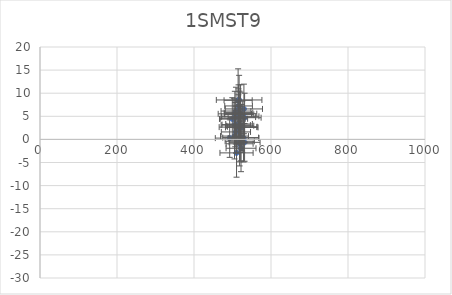
| Category | 1SMST9 |
|---|---|
| 522.1588718210713 | -1.918 |
| 521.2347924595763 | 0.388 |
| 520.9613922210696 | 5.572 |
| 515.7727397579669 | 7.243 |
| 531.3620200133205 | -0.638 |
| 514.6045491450993 | 8.468 |
| 531.4300875531192 | 4.699 |
| 525.4199585209968 | 2.736 |
| 505.1796562790476 | 0.717 |
| 520.3470491262707 | 4.999 |
| 528.7181472478737 | 0.305 |
| 524.0540877693186 | 2.597 |
| 503.689843800591 | 4.465 |
| 508.44170407156315 | 3.099 |
| 517.1966549007905 | 8.538 |
| 517.7014277150932 | 5.407 |
| 529.6562029807247 | 6.595 |
| 509.01194083806786 | 6.136 |
| 518.8135754331252 | -0.402 |
| 514.2731834310808 | 2.663 |
| 515.3000976672669 | 4.829 |
| 517.0099884778939 | 3.33 |
| 520.0842979364114 | 2.957 |
| 492.702394362094 | 0.28 |
| 510.4939043481418 | -2.919 |
| 506.12668842200827 | 5.532 |
| 518.4799722846992 | -0.946 |
| 508.8999551757176 | 1.617 |
| 515.57201752652 | 5.801 |
| 499.49552152559244 | 4.43 |
| 506.9851726054833 | 3.202 |